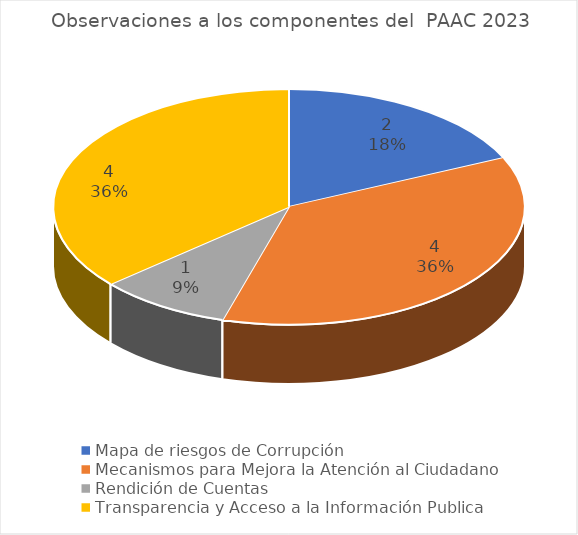
| Category | Observaciones a los componentes del  PAAC 2023 |
|---|---|
| Mapa de riesgos de Corrupción | 2 |
| Mecanismos para Mejora la Atención al Ciudadano | 4 |
| Rendición de Cuentas | 1 |
| Transparencia y Acceso a la Información Publica | 4 |